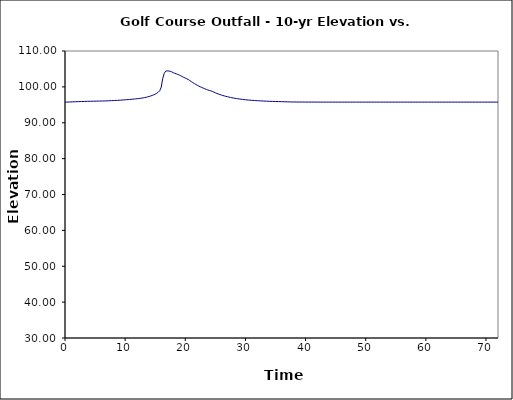
| Category | Series 1 |
|---|---|
| 0.0 | 95.75 |
| 0.25 | 95.753 |
| 0.5 | 95.764 |
| 0.75 | 95.782 |
| 1.0 | 95.803 |
| 1.25 | 95.823 |
| 1.5 | 95.841 |
| 1.75 | 95.859 |
| 2.0 | 95.874 |
| 2.25 | 95.89 |
| 2.5 | 95.905 |
| 2.75 | 95.919 |
| 3.0 | 95.932 |
| 3.25 | 95.944 |
| 3.5 | 95.957 |
| 3.75 | 95.968 |
| 4.0 | 95.979 |
| 4.25 | 95.989 |
| 4.5 | 95.999 |
| 4.75 | 96.008 |
| 5.0 | 96.017 |
| 5.25 | 96.025 |
| 5.5 | 96.033 |
| 5.75 | 96.042 |
| 6.0 | 96.05 |
| 6.25 | 96.061 |
| 6.5 | 96.073 |
| 6.75 | 96.087 |
| 7.0 | 96.103 |
| 7.25 | 96.12 |
| 7.5 | 96.14 |
| 7.75 | 96.159 |
| 8.0 | 96.18 |
| 8.25 | 96.202 |
| 8.5 | 96.225 |
| 8.75 | 96.249 |
| 9.0 | 96.274 |
| 9.25 | 96.302 |
| 9.5 | 96.33 |
| 9.75 | 96.362 |
| 10.0 | 96.394 |
| 10.25 | 96.427 |
| 10.5 | 96.461 |
| 10.75 | 96.496 |
| 11.0 | 96.531 |
| 11.25 | 96.57 |
| 11.5 | 96.61 |
| 11.75 | 96.655 |
| 12.0 | 96.702 |
| 12.25 | 96.754 |
| 12.5 | 96.81 |
| 12.75 | 96.87 |
| 13.0 | 96.934 |
| 13.25 | 97.011 |
| 13.5 | 97.102 |
| 13.75 | 97.209 |
| 14.0 | 97.331 |
| 14.25 | 97.463 |
| 14.5 | 97.61 |
| 14.75 | 97.779 |
| 15.0 | 97.977 |
| 15.25 | 98.213 |
| 15.5 | 98.502 |
| 15.75 | 98.937 |
| 16.0 | 99.938 |
| 16.25 | 102.325 |
| 16.5 | 103.76 |
| 16.75 | 104.395 |
| 17.0 | 104.453 |
| 17.25 | 104.426 |
| 17.5 | 104.344 |
| 17.75 | 104.186 |
| 18.0 | 103.945 |
| 18.25 | 103.797 |
| 18.5 | 103.629 |
| 18.75 | 103.464 |
| 19.0 | 103.306 |
| 19.25 | 103.088 |
| 19.5 | 102.869 |
| 19.75 | 102.654 |
| 20.0 | 102.448 |
| 20.25 | 102.243 |
| 20.5 | 102.051 |
| 20.75 | 101.763 |
| 21.0 | 101.471 |
| 21.25 | 101.195 |
| 21.5 | 100.933 |
| 21.75 | 100.685 |
| 22.0 | 100.45 |
| 22.25 | 100.228 |
| 22.5 | 100.022 |
| 22.75 | 99.827 |
| 23.0 | 99.642 |
| 23.25 | 99.467 |
| 23.5 | 99.301 |
| 23.75 | 99.143 |
| 24.0 | 99.005 |
| 24.25 | 98.89 |
| 24.5 | 98.726 |
| 24.75 | 98.537 |
| 25.0 | 98.351 |
| 25.25 | 98.178 |
| 25.5 | 98.018 |
| 25.75 | 97.868 |
| 26.0 | 97.729 |
| 26.25 | 97.599 |
| 26.5 | 97.477 |
| 26.75 | 97.364 |
| 27.0 | 97.258 |
| 27.25 | 97.159 |
| 27.5 | 97.067 |
| 27.75 | 96.979 |
| 28.0 | 96.894 |
| 28.25 | 96.818 |
| 28.5 | 96.748 |
| 28.75 | 96.684 |
| 29.0 | 96.623 |
| 29.25 | 96.567 |
| 29.5 | 96.514 |
| 29.75 | 96.465 |
| 30.0 | 96.419 |
| 30.25 | 96.376 |
| 30.5 | 96.335 |
| 30.75 | 96.297 |
| 31.0 | 96.262 |
| 31.25 | 96.23 |
| 31.5 | 96.2 |
| 31.75 | 96.17 |
| 32.0 | 96.142 |
| 32.25 | 96.117 |
| 32.5 | 96.094 |
| 32.75 | 96.071 |
| 33.0 | 96.05 |
| 33.25 | 96.031 |
| 33.5 | 96.013 |
| 33.75 | 95.996 |
| 34.0 | 95.979 |
| 34.25 | 95.965 |
| 34.5 | 95.95 |
| 34.75 | 95.937 |
| 35.0 | 95.923 |
| 35.25 | 95.912 |
| 35.5 | 95.901 |
| 35.75 | 95.89 |
| 36.0 | 95.88 |
| 36.25 | 95.869 |
| 36.5 | 95.859 |
| 36.75 | 95.848 |
| 37.0 | 95.832 |
| 37.25 | 95.814 |
| 37.5 | 95.8 |
| 37.75 | 95.795 |
| 38.0 | 95.789 |
| 38.25 | 95.785 |
| 38.5 | 95.782 |
| 38.75 | 95.778 |
| 39.0 | 95.775 |
| 39.25 | 95.772 |
| 39.5 | 95.771 |
| 39.75 | 95.768 |
| 40.0 | 95.767 |
| 40.25 | 95.765 |
| 40.5 | 95.763 |
| 40.75 | 95.761 |
| 41.0 | 95.761 |
| 41.25 | 95.76 |
| 41.5 | 95.758 |
| 41.75 | 95.757 |
| 42.0 | 95.757 |
| 42.25 | 95.756 |
| 42.5 | 95.754 |
| 42.75 | 95.754 |
| 43.0 | 95.754 |
| 43.25 | 95.753 |
| 43.5 | 95.753 |
| 43.75 | 95.751 |
| 44.0 | 95.751 |
| 44.25 | 95.751 |
| 44.5 | 95.751 |
| 44.75 | 95.75 |
| 45.0 | 95.75 |
| 45.25 | 95.75 |
| 45.5 | 95.75 |
| 45.75 | 95.75 |
| 46.0 | 95.75 |
| 46.25 | 95.75 |
| 46.5 | 95.75 |
| 46.75 | 95.75 |
| 47.0 | 95.75 |
| 47.25 | 95.75 |
| 47.5 | 95.75 |
| 47.75 | 95.75 |
| 48.0 | 95.75 |
| 48.25 | 95.75 |
| 48.5 | 95.75 |
| 48.75 | 95.75 |
| 49.0 | 95.75 |
| 49.25 | 95.75 |
| 49.5 | 95.75 |
| 49.75 | 95.75 |
| 50.0 | 95.75 |
| 50.25 | 95.75 |
| 50.5 | 95.75 |
| 50.75 | 95.75 |
| 51.0 | 95.75 |
| 51.25 | 95.75 |
| 51.5 | 95.75 |
| 51.75 | 95.75 |
| 52.0 | 95.75 |
| 52.25 | 95.75 |
| 52.5 | 95.75 |
| 52.75 | 95.75 |
| 53.0 | 95.75 |
| 53.25 | 95.75 |
| 53.5 | 95.75 |
| 53.75 | 95.75 |
| 54.0 | 95.75 |
| 54.25 | 95.75 |
| 54.5 | 95.75 |
| 54.75 | 95.75 |
| 55.0 | 95.75 |
| 55.25 | 95.75 |
| 55.5 | 95.75 |
| 55.75 | 95.75 |
| 56.0 | 95.75 |
| 56.25 | 95.75 |
| 56.5 | 95.75 |
| 56.75 | 95.75 |
| 57.0 | 95.75 |
| 57.25 | 95.75 |
| 57.5 | 95.75 |
| 57.75 | 95.75 |
| 58.0 | 95.75 |
| 58.25 | 95.75 |
| 58.5 | 95.75 |
| 58.75 | 95.75 |
| 59.0 | 95.75 |
| 59.25 | 95.75 |
| 59.5 | 95.75 |
| 59.75 | 95.75 |
| 60.0 | 95.75 |
| 60.25 | 95.75 |
| 60.5 | 95.75 |
| 60.75 | 95.75 |
| 61.0 | 95.75 |
| 61.25 | 95.75 |
| 61.5 | 95.75 |
| 61.75 | 95.75 |
| 62.0 | 95.75 |
| 62.25 | 95.75 |
| 62.5 | 95.75 |
| 62.75 | 95.75 |
| 63.0 | 95.75 |
| 63.25 | 95.75 |
| 63.5 | 95.75 |
| 63.75 | 95.75 |
| 64.0 | 95.75 |
| 64.25 | 95.75 |
| 64.5 | 95.75 |
| 64.75 | 95.75 |
| 65.0 | 95.75 |
| 65.25 | 95.75 |
| 65.5 | 95.75 |
| 65.75 | 95.75 |
| 66.0 | 95.75 |
| 66.25 | 95.75 |
| 66.5 | 95.75 |
| 66.75 | 95.75 |
| 67.0 | 95.75 |
| 67.25 | 95.75 |
| 67.5 | 95.75 |
| 67.75 | 95.75 |
| 68.0 | 95.75 |
| 68.25 | 95.75 |
| 68.5 | 95.75 |
| 68.75 | 95.75 |
| 69.0 | 95.75 |
| 69.25 | 95.75 |
| 69.5 | 95.75 |
| 69.75 | 95.75 |
| 70.0 | 95.75 |
| 70.25 | 95.75 |
| 70.5 | 95.75 |
| 70.75 | 95.75 |
| 71.0 | 95.75 |
| 71.25 | 95.75 |
| 71.5 | 95.75 |
| 71.75 | 95.75 |
| 72.0 | 95.75 |
| 72.25 | 95.75 |
| 72.5 | 95.75 |
| 72.75 | 95.75 |
| 73.0 | 95.75 |
| 73.25 | 95.75 |
| 73.5 | 95.75 |
| 73.75 | 95.75 |
| 74.0 | 95.75 |
| 74.25 | 95.75 |
| 74.5 | 95.75 |
| 74.75 | 95.75 |
| 75.0 | 95.75 |
| 75.25 | 95.75 |
| 75.5 | 95.75 |
| 75.75 | 95.75 |
| 76.0 | 95.75 |
| 76.25 | 95.75 |
| 76.5 | 95.75 |
| 76.75 | 95.75 |
| 77.0 | 95.75 |
| 77.25 | 95.75 |
| 77.5 | 95.75 |
| 77.75 | 95.75 |
| 78.0 | 95.75 |
| 78.25 | 95.75 |
| 78.5 | 95.75 |
| 78.75 | 95.75 |
| 79.0 | 95.75 |
| 79.25 | 95.75 |
| 79.5 | 95.75 |
| 79.75 | 95.75 |
| 80.0 | 95.75 |
| 80.25 | 95.75 |
| 80.5 | 95.75 |
| 80.75 | 95.75 |
| 81.0 | 95.75 |
| 81.25 | 95.75 |
| 81.5 | 95.75 |
| 81.75 | 95.75 |
| 82.0 | 95.75 |
| 82.25 | 95.75 |
| 82.5 | 95.75 |
| 82.75 | 95.75 |
| 83.0 | 95.75 |
| 83.25 | 95.75 |
| 83.5 | 95.75 |
| 83.75 | 95.75 |
| 84.0 | 95.75 |
| 84.25 | 95.75 |
| 84.5 | 95.75 |
| 84.75 | 95.75 |
| 85.0 | 95.75 |
| 85.25 | 95.75 |
| 85.5 | 95.75 |
| 85.75 | 95.75 |
| 86.0 | 95.75 |
| 86.25 | 95.75 |
| 86.5 | 95.75 |
| 86.75 | 95.75 |
| 87.0 | 95.75 |
| 87.25 | 95.75 |
| 87.5 | 95.75 |
| 87.75 | 95.75 |
| 88.0 | 95.75 |
| 88.25 | 95.75 |
| 88.5 | 95.75 |
| 88.75 | 95.75 |
| 89.0 | 95.75 |
| 89.25 | 95.75 |
| 89.5 | 95.75 |
| 89.75 | 95.75 |
| 90.0 | 95.75 |
| 90.25 | 95.75 |
| 90.5 | 95.75 |
| 90.75 | 95.75 |
| 91.0 | 95.75 |
| 91.25 | 95.75 |
| 91.5 | 95.75 |
| 91.75 | 95.75 |
| 92.0 | 95.75 |
| 92.25 | 95.75 |
| 92.5 | 95.75 |
| 92.75 | 95.75 |
| 93.0 | 95.75 |
| 93.25 | 95.75 |
| 93.5 | 95.75 |
| 93.75 | 95.75 |
| 94.0 | 95.75 |
| 94.25 | 95.75 |
| 94.5 | 95.75 |
| 94.75 | 95.75 |
| 95.0 | 95.75 |
| 95.25 | 95.75 |
| 95.5 | 95.75 |
| 95.75 | 95.75 |
| 96.0 | 95.75 |
| 96.25 | 95.75 |
| 96.5 | 95.75 |
| 96.75 | 95.75 |
| 97.0 | 95.75 |
| 97.25 | 95.75 |
| 97.5 | 95.75 |
| 97.75 | 95.75 |
| 98.0 | 95.75 |
| 98.25 | 95.75 |
| 98.5 | 95.75 |
| 98.75 | 95.75 |
| 99.0 | 95.75 |
| 99.25 | 95.75 |
| 99.5 | 95.75 |
| 99.75 | 95.75 |
| 100.0 | 95.75 |
| 100.25 | 95.75 |
| 100.5 | 95.75 |
| 100.75 | 95.75 |
| 101.0 | 95.75 |
| 101.25 | 95.75 |
| 101.5 | 95.75 |
| 101.75 | 95.75 |
| 102.0 | 95.75 |
| 102.25 | 95.75 |
| 102.5 | 95.75 |
| 102.75 | 95.75 |
| 103.0 | 95.75 |
| 103.25 | 95.75 |
| 103.5 | 95.75 |
| 103.75 | 95.75 |
| 104.0 | 95.75 |
| 104.25 | 95.75 |
| 104.5 | 95.75 |
| 104.75 | 95.75 |
| 105.0 | 95.75 |
| 105.25 | 95.75 |
| 105.5 | 95.75 |
| 105.75 | 95.75 |
| 106.0 | 95.75 |
| 106.25 | 95.75 |
| 106.5 | 95.75 |
| 106.75 | 95.75 |
| 107.0 | 95.75 |
| 107.25 | 95.75 |
| 107.5 | 95.75 |
| 107.75 | 95.75 |
| 108.0 | 95.75 |
| 108.25 | 95.75 |
| 108.5 | 95.75 |
| 108.75 | 95.75 |
| 109.0 | 95.75 |
| 109.25 | 95.75 |
| 109.5 | 95.75 |
| 109.75 | 95.75 |
| 110.0 | 95.75 |
| 110.25 | 95.75 |
| 110.5 | 95.75 |
| 110.75 | 95.75 |
| 111.0 | 95.75 |
| 111.25 | 95.75 |
| 111.5 | 95.75 |
| 111.75 | 95.75 |
| 112.0 | 95.75 |
| 112.25 | 95.75 |
| 112.5 | 95.75 |
| 112.75 | 95.75 |
| 113.0 | 95.75 |
| 113.25 | 95.75 |
| 113.5 | 95.75 |
| 113.75 | 95.75 |
| 114.0 | 95.75 |
| 114.25 | 95.75 |
| 114.5 | 95.75 |
| 114.75 | 95.75 |
| 115.0 | 95.75 |
| 115.25 | 95.75 |
| 115.5 | 95.75 |
| 115.75 | 95.75 |
| 116.0 | 95.75 |
| 116.25 | 95.75 |
| 116.5 | 95.75 |
| 116.75 | 95.75 |
| 117.0 | 95.75 |
| 117.25 | 95.75 |
| 117.5 | 95.75 |
| 117.75 | 95.75 |
| 118.0 | 95.75 |
| 118.25 | 95.75 |
| 118.5 | 95.75 |
| 118.75 | 95.75 |
| 119.0 | 95.75 |
| 119.25 | 95.75 |
| 119.5 | 95.75 |
| 119.75 | 95.75 |
| 120.0 | 95.75 |
| 120.25 | 95.75 |
| 120.5 | 95.75 |
| 120.75 | 95.75 |
| 121.0 | 95.75 |
| 121.25 | 95.75 |
| 121.5 | 95.75 |
| 121.75 | 95.75 |
| 122.0 | 95.75 |
| 122.25 | 95.75 |
| 122.5 | 95.75 |
| 122.75 | 95.75 |
| 123.0 | 95.75 |
| 123.25 | 95.75 |
| 123.5 | 95.75 |
| 123.75 | 95.75 |
| 124.0 | 95.75 |
| 124.25 | 95.75 |
| 124.5 | 95.75 |
| 124.75 | 95.75 |
| 125.0 | 95.75 |
| 125.25 | 95.75 |
| 125.5 | 95.75 |
| 125.75 | 95.75 |
| 126.0 | 95.75 |
| 126.25 | 95.75 |
| 126.5 | 95.75 |
| 126.75 | 95.75 |
| 127.0 | 95.75 |
| 127.25 | 95.75 |
| 127.5 | 95.75 |
| 127.75 | 95.75 |
| 128.0 | 95.75 |
| 128.25 | 95.75 |
| 128.5 | 95.75 |
| 128.75 | 95.75 |
| 129.0 | 95.75 |
| 129.25 | 95.75 |
| 129.5 | 95.75 |
| 129.75 | 95.75 |
| 130.0 | 95.75 |
| 130.25 | 95.75 |
| 130.5 | 95.75 |
| 130.75 | 95.75 |
| 131.0 | 95.75 |
| 131.25 | 95.75 |
| 131.5 | 95.75 |
| 131.75 | 95.75 |
| 132.0 | 95.75 |
| 132.25 | 95.75 |
| 132.5 | 95.75 |
| 132.75 | 95.75 |
| 133.0 | 95.75 |
| 133.25 | 95.75 |
| 133.5 | 95.75 |
| 133.75 | 95.75 |
| 134.0 | 95.75 |
| 134.25 | 95.75 |
| 134.5 | 95.75 |
| 134.75 | 95.75 |
| 135.0 | 95.75 |
| 135.25 | 95.75 |
| 135.5 | 95.75 |
| 135.75 | 95.75 |
| 136.0 | 95.75 |
| 136.25 | 95.75 |
| 136.5 | 95.75 |
| 136.75 | 95.75 |
| 137.0 | 95.75 |
| 137.25 | 95.75 |
| 137.5 | 95.75 |
| 137.75 | 95.75 |
| 138.0 | 95.75 |
| 138.25 | 95.75 |
| 138.5 | 95.75 |
| 138.75 | 95.75 |
| 139.0 | 95.75 |
| 139.25 | 95.75 |
| 139.5 | 95.75 |
| 139.75 | 95.75 |
| 140.0 | 95.75 |
| 140.25 | 95.75 |
| 140.5 | 95.75 |
| 140.75 | 95.75 |
| 141.0 | 95.75 |
| 141.25 | 95.75 |
| 141.5 | 95.75 |
| 141.75 | 95.75 |
| 142.0 | 95.75 |
| 142.25 | 95.75 |
| 142.5 | 95.75 |
| 142.75 | 95.75 |
| 143.0 | 95.75 |
| 143.25 | 95.75 |
| 143.5 | 95.75 |
| 143.75 | 95.75 |
| 144.0 | 95.75 |
| 144.25 | 95.75 |
| 144.5 | 95.75 |
| 144.75 | 95.75 |
| 145.0 | 95.75 |
| 145.25 | 95.75 |
| 145.5 | 95.75 |
| 145.75 | 95.75 |
| 146.0 | 95.75 |
| 146.25 | 95.75 |
| 146.5 | 95.75 |
| 146.75 | 95.75 |
| 147.0 | 95.75 |
| 147.25 | 95.75 |
| 147.5 | 95.75 |
| 147.75 | 95.75 |
| 148.0 | 95.75 |
| 148.25 | 95.75 |
| 148.5 | 95.75 |
| 148.75 | 95.75 |
| 149.0 | 95.75 |
| 149.25 | 95.75 |
| 149.5 | 95.75 |
| 149.75 | 95.75 |
| 150.0 | 95.75 |
| 150.25 | 95.75 |
| 150.5 | 95.75 |
| 150.75 | 95.75 |
| 151.0 | 95.75 |
| 151.25 | 95.75 |
| 151.5 | 95.75 |
| 151.75 | 95.75 |
| 152.0 | 95.75 |
| 152.25 | 95.75 |
| 152.5 | 95.75 |
| 152.75 | 95.75 |
| 153.0 | 95.75 |
| 153.25 | 95.75 |
| 153.5 | 95.75 |
| 153.75 | 95.75 |
| 154.0 | 95.75 |
| 154.25 | 95.75 |
| 154.5 | 95.75 |
| 154.75 | 95.75 |
| 155.0 | 95.75 |
| 155.25 | 95.75 |
| 155.5 | 95.75 |
| 155.75 | 95.75 |
| 156.0 | 95.75 |
| 156.25 | 95.75 |
| 156.5 | 95.75 |
| 156.75 | 95.75 |
| 157.0 | 95.75 |
| 157.25 | 95.75 |
| 157.5 | 95.75 |
| 157.75 | 95.75 |
| 158.0 | 95.75 |
| 158.25 | 95.75 |
| 158.5 | 95.75 |
| 158.75 | 95.75 |
| 159.0 | 95.75 |
| 159.25 | 95.75 |
| 159.5 | 95.75 |
| 159.75 | 95.75 |
| 160.0 | 95.75 |
| 160.25 | 95.75 |
| 160.5 | 95.75 |
| 160.75 | 95.75 |
| 161.0 | 95.75 |
| 161.25 | 95.75 |
| 161.5 | 95.75 |
| 161.75 | 95.75 |
| 162.0 | 95.75 |
| 162.25 | 95.75 |
| 162.5 | 95.75 |
| 162.75 | 95.75 |
| 163.0 | 95.75 |
| 163.25 | 95.75 |
| 163.5 | 95.75 |
| 163.75 | 95.75 |
| 164.0 | 95.75 |
| 164.25 | 95.75 |
| 164.5 | 95.75 |
| 164.75 | 95.75 |
| 165.0 | 95.75 |
| 165.25 | 95.75 |
| 165.5 | 95.75 |
| 165.75 | 95.75 |
| 166.0 | 95.75 |
| 166.25 | 95.75 |
| 166.5 | 95.75 |
| 166.75 | 95.75 |
| 167.0 | 95.75 |
| 167.25 | 95.75 |
| 167.5 | 95.75 |
| 167.75 | 95.75 |
| 168.0 | 95.75 |
| 168.25 | 95.75 |
| 168.5 | 95.75 |
| 168.75 | 95.75 |
| 169.0 | 95.75 |
| 169.25 | 95.75 |
| 169.5 | 95.75 |
| 169.75 | 95.75 |
| 170.0 | 95.75 |
| 170.25 | 95.75 |
| 170.5 | 95.75 |
| 170.75 | 95.75 |
| 171.0 | 95.75 |
| 171.25 | 95.75 |
| 171.5 | 95.75 |
| 171.75 | 95.75 |
| 172.0 | 95.75 |
| 172.25 | 95.75 |
| 172.5 | 95.75 |
| 172.75 | 95.75 |
| 173.0 | 95.75 |
| 173.25 | 95.75 |
| 173.5 | 95.75 |
| 173.75 | 95.75 |
| 174.0 | 95.75 |
| 174.25 | 95.75 |
| 174.5 | 95.75 |
| 174.75 | 95.75 |
| 175.0 | 95.75 |
| 175.25 | 95.75 |
| 175.5 | 95.75 |
| 175.75 | 95.75 |
| 176.0 | 95.75 |
| 176.25 | 95.75 |
| 176.5 | 95.75 |
| 176.75 | 95.75 |
| 177.0 | 95.75 |
| 177.25 | 95.75 |
| 177.5 | 95.75 |
| 177.75 | 95.75 |
| 178.0 | 95.75 |
| 178.25 | 95.75 |
| 178.5 | 95.75 |
| 178.75 | 95.75 |
| 179.0 | 95.75 |
| 179.25 | 95.75 |
| 179.5 | 95.75 |
| 179.75 | 95.75 |
| 180.0 | 95.75 |
| 180.25 | 95.75 |
| 180.5 | 95.75 |
| 180.75 | 95.75 |
| 181.0 | 95.75 |
| 181.25 | 95.75 |
| 181.5 | 95.75 |
| 181.75 | 95.75 |
| 182.0 | 95.75 |
| 182.25 | 95.75 |
| 182.5 | 95.75 |
| 182.75 | 95.75 |
| 183.0 | 95.75 |
| 183.25 | 95.75 |
| 183.5 | 95.75 |
| 183.75 | 95.75 |
| 184.0 | 95.75 |
| 184.25 | 95.75 |
| 184.5 | 95.75 |
| 184.75 | 95.75 |
| 185.0 | 95.75 |
| 185.25 | 95.75 |
| 185.5 | 95.75 |
| 185.75 | 95.75 |
| 186.0 | 95.75 |
| 186.25 | 95.75 |
| 186.5 | 95.75 |
| 186.75 | 95.75 |
| 187.0 | 95.75 |
| 187.25 | 95.75 |
| 187.5 | 95.75 |
| 187.75 | 95.75 |
| 188.0 | 95.75 |
| 188.25 | 95.75 |
| 188.5 | 95.75 |
| 188.75 | 95.75 |
| 189.0 | 95.75 |
| 189.25 | 95.75 |
| 189.5 | 95.75 |
| 189.75 | 95.75 |
| 190.0 | 95.75 |
| 190.25 | 95.75 |
| 190.5 | 95.75 |
| 190.75 | 95.75 |
| 191.0 | 95.75 |
| 191.25 | 95.75 |
| 191.5 | 95.75 |
| 191.75 | 95.75 |